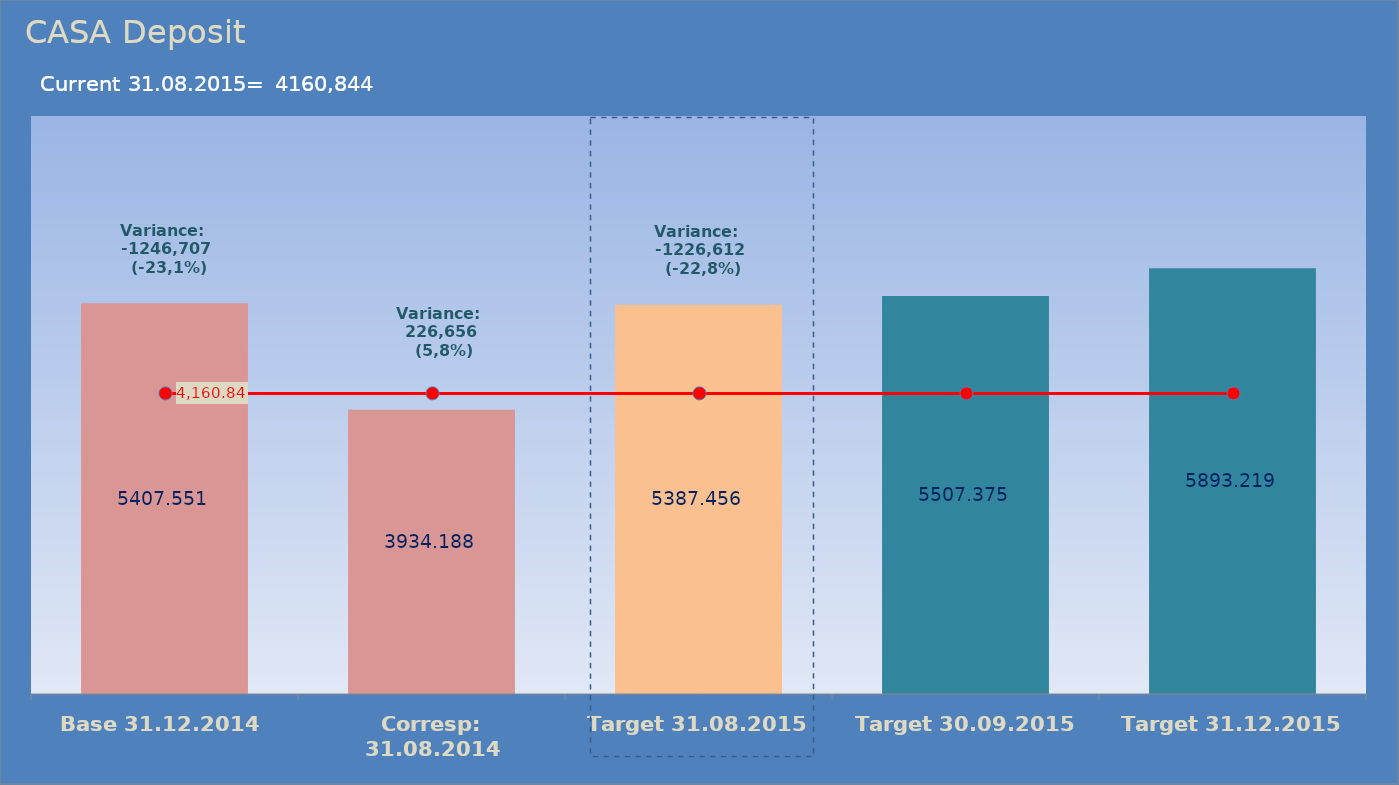
| Category | Bar |
|---|---|
| Base 31.12.2014 | 5407.551 |
| Corresp: 31.08.2014 | 3934.188 |
| Target 31.08.2015 | 5387.456 |
| Target 30.09.2015 | 5507.375 |
| Target 31.12.2015 | 5893.219 |